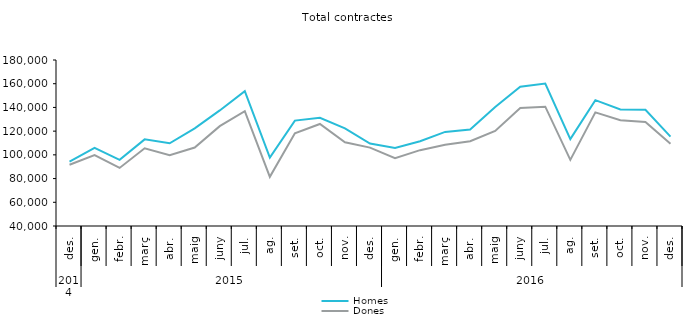
| Category | Homes | Dones |
|---|---|---|
| 0 | 94313 | 91701 |
| 1 | 105940 | 99812 |
| 2 | 95836 | 88965 |
| 3 | 113064 | 105535 |
| 4 | 109798 | 99709 |
| 5 | 122391 | 106197 |
| 6 | 137474 | 124208 |
| 7 | 153675 | 136825 |
| 8 | 97759 | 81492 |
| 9 | 128889 | 118269 |
| 10 | 131293 | 126058 |
| 11 | 122350 | 110629 |
| 12 | 109542 | 106105 |
| 13 | 105715 | 97179 |
| 14 | 111439 | 103954 |
| 15 | 119348 | 108465 |
| 16 | 121402 | 111539 |
| 17 | 140342 | 120229 |
| 18 | 157406 | 139485 |
| 19 | 160205 | 140647 |
| 20 | 113317 | 95771 |
| 21 | 146110 | 135822 |
| 22 | 138280 | 129162 |
| 23 | 138089 | 127801 |
| 24 | 115428 | 109423 |